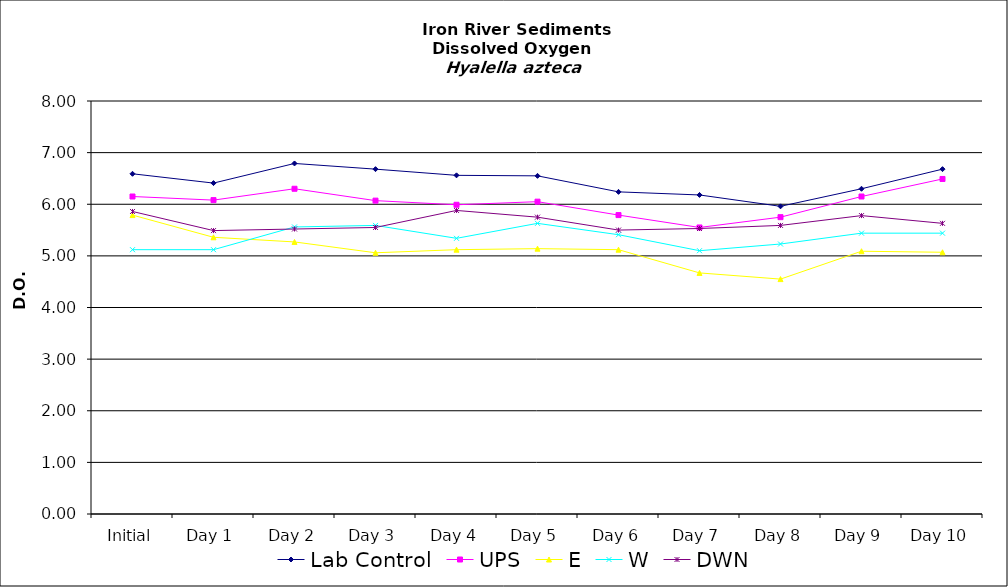
| Category | Lab Control | UPS | E | W | DWN |
|---|---|---|---|---|---|
| Initial | 6.59 | 6.15 | 5.79 | 5.12 | 5.86 |
| Day 1 | 6.41 | 6.08 | 5.36 | 5.12 | 5.49 |
| Day 2 | 6.79 | 6.3 | 5.27 | 5.56 | 5.52 |
| Day 3 | 6.68 | 6.07 | 5.06 | 5.59 | 5.55 |
| Day 4 | 6.56 | 5.99 | 5.12 | 5.34 | 5.88 |
| Day 5 | 6.55 | 6.05 | 5.14 | 5.63 | 5.75 |
| Day 6 | 6.24 | 5.79 | 5.12 | 5.41 | 5.5 |
| Day 7 | 6.18 | 5.55 | 4.67 | 5.1 | 5.53 |
| Day 8 | 5.96 | 5.75 | 4.55 | 5.23 | 5.59 |
| Day 9 | 6.3 | 6.15 | 5.09 | 5.44 | 5.78 |
| Day 10 | 6.68 | 6.49 | 5.07 | 5.44 | 5.63 |